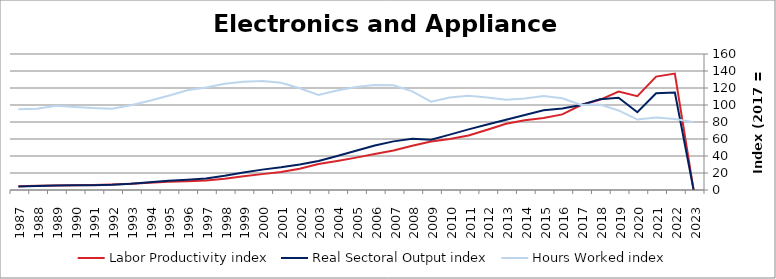
| Category | Labor Productivity index | Real Sectoral Output index | Hours Worked index |
|---|---|---|---|
| 2023.0 | 0 | 0 | 79.713 |
| 2022.0 | 137.008 | 114.588 | 83.636 |
| 2021.0 | 133.404 | 113.764 | 85.278 |
| 2020.0 | 110.443 | 91.555 | 82.898 |
| 2019.0 | 115.922 | 108.502 | 93.599 |
| 2018.0 | 106.099 | 106.713 | 100.579 |
| 2017.0 | 100 | 100 | 100 |
| 2016.0 | 88.93 | 95.911 | 107.85 |
| 2015.0 | 84.772 | 93.757 | 110.599 |
| 2014.0 | 81.939 | 88.201 | 107.642 |
| 2013.0 | 77.915 | 82.696 | 106.136 |
| 2012.0 | 70.952 | 77.12 | 108.693 |
| 2011.0 | 64.217 | 71.289 | 111.012 |
| 2010.0 | 59.905 | 65.152 | 108.758 |
| 2009.0 | 56.956 | 59.199 | 103.937 |
| 2008.0 | 51.963 | 60.3 | 116.043 |
| 2007.0 | 46.441 | 57.22 | 123.208 |
| 2006.0 | 42.281 | 52.276 | 123.638 |
| 2005.0 | 38.075 | 46.089 | 121.049 |
| 2004.0 | 34.173 | 40.015 | 117.095 |
| 2003.0 | 30.508 | 34.089 | 111.736 |
| 2002.0 | 25.065 | 29.989 | 119.643 |
| 2001.0 | 21.163 | 26.689 | 126.112 |
| 2000.0 | 18.682 | 23.969 | 128.302 |
| 1999.0 | 16.256 | 20.692 | 127.289 |
| 1998.0 | 13.349 | 16.682 | 124.966 |
| 1997.0 | 11.192 | 13.493 | 120.558 |
| 1996.0 | 10.403 | 12.2 | 117.274 |
| 1995.0 | 9.78 | 10.851 | 110.941 |
| 1994.0 | 8.585 | 9.014 | 105.001 |
| 1993.0 | 7.38 | 7.35 | 99.595 |
| 1992.0 | 6.559 | 6.279 | 95.729 |
| 1991.0 | 5.943 | 5.727 | 96.365 |
| 1990.0 | 5.587 | 5.455 | 97.635 |
| 1989.0 | 5.272 | 5.218 | 98.986 |
| 1988.0 | 5.03 | 4.813 | 95.69 |
| 1987.0 | 4.47 | 4.247 | 95.018 |